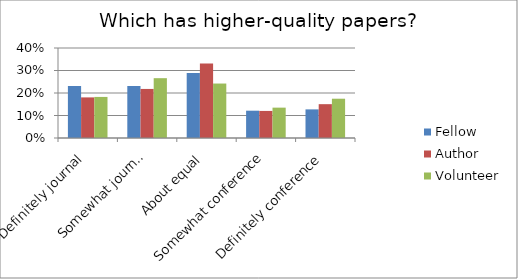
| Category | Fellow | Author | Volunteer |
|---|---|---|---|
| Definitely journal | 0.231 | 0.18 | 0.183 |
| Somewhat journal | 0.231 | 0.218 | 0.266 |
| About equal | 0.289 | 0.331 | 0.242 |
| Somewhat conference | 0.121 | 0.12 | 0.135 |
| Definitely conference | 0.127 | 0.15 | 0.175 |